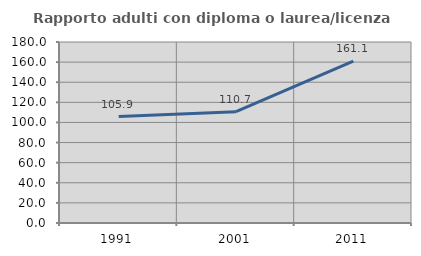
| Category | Rapporto adulti con diploma o laurea/licenza media  |
|---|---|
| 1991.0 | 105.882 |
| 2001.0 | 110.68 |
| 2011.0 | 161.053 |